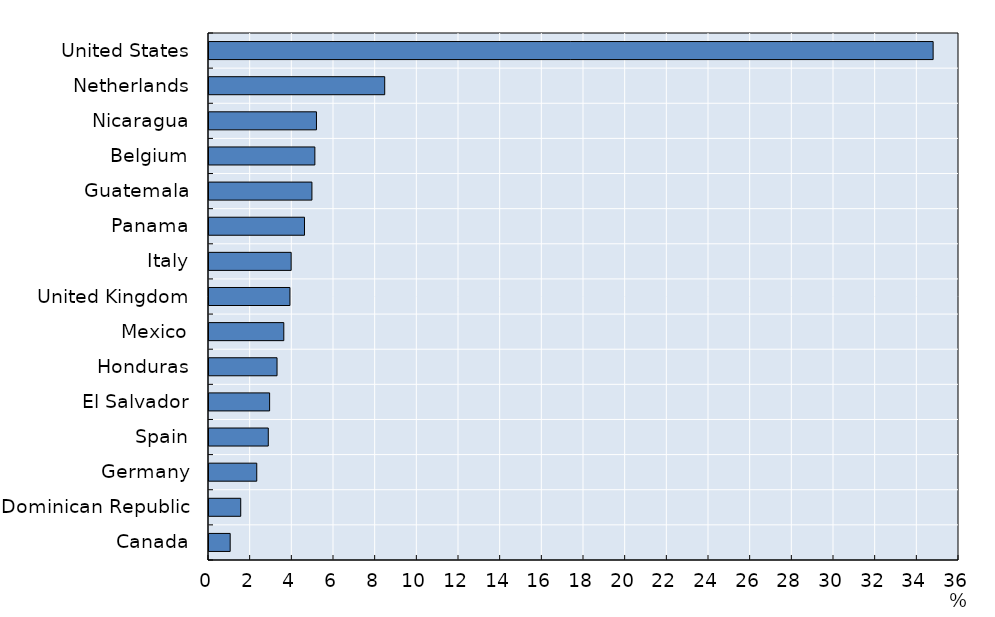
| Category | Series 0 |
|---|---|
| Canada | 1.017 |
| Dominican Republic | 1.523 |
| Germany | 2.292 |
| Spain | 2.846 |
| El Salvador | 2.91 |
| Honduras | 3.266 |
| Mexico | 3.59 |
| United Kingdom | 3.885 |
| Italy | 3.944 |
| Panama | 4.584 |
| Guatemala | 4.941 |
| Belgium | 5.082 |
| Nicaragua | 5.158 |
| Netherlands | 8.434 |
| United States | 34.758 |